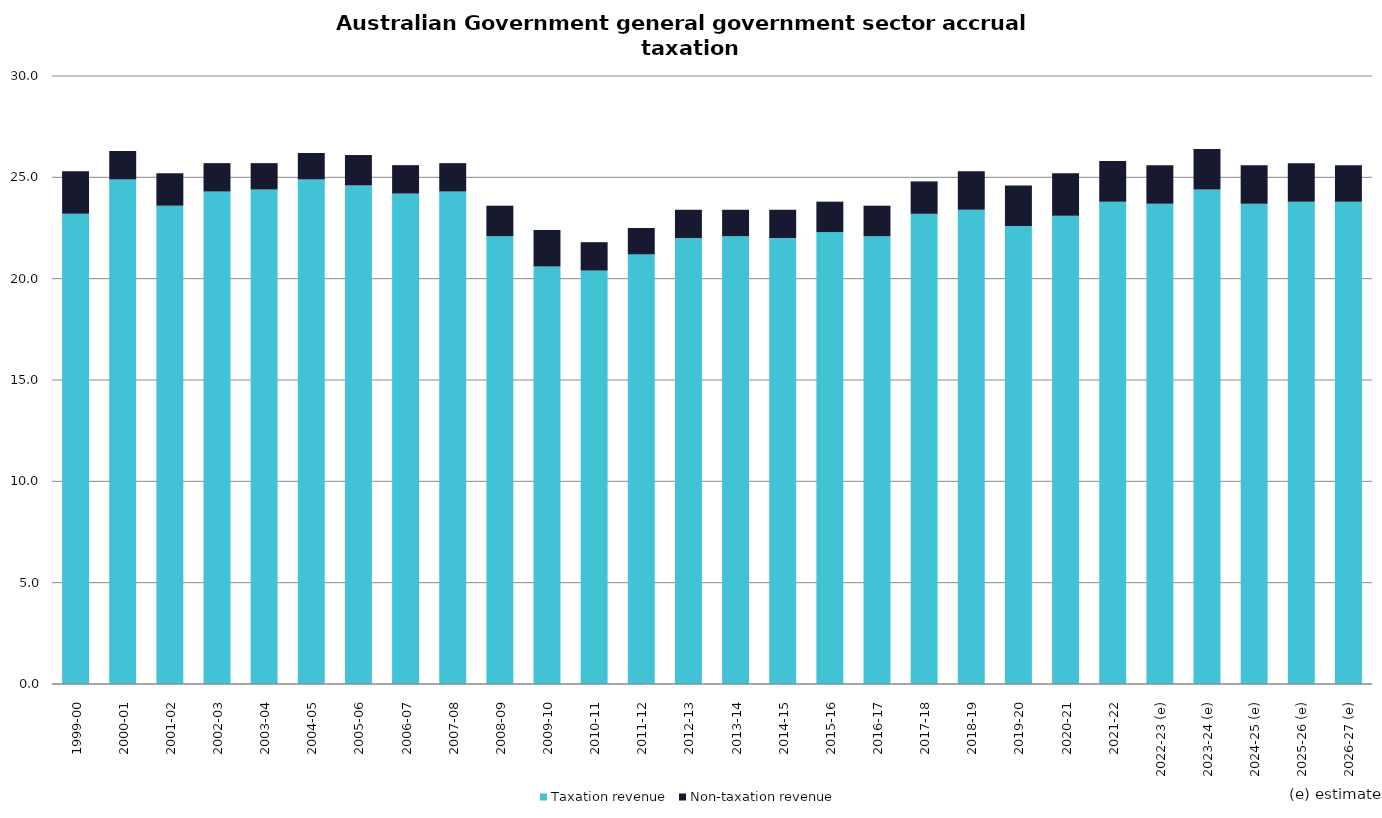
| Category | Taxation revenue | Non-taxation revenue |
|---|---|---|
| 1999-00 | 23.2 | 2.1 |
| 2000-01 | 24.9 | 1.4 |
| 2001-02 | 23.6 | 1.6 |
| 2002-03 | 24.3 | 1.4 |
| 2003-04 | 24.4 | 1.3 |
| 2004-05 | 24.9 | 1.3 |
| 2005-06 | 24.6 | 1.5 |
| 2006-07 | 24.2 | 1.4 |
| 2007-08 | 24.3 | 1.4 |
| 2008-09 | 22.1 | 1.5 |
| 2009-10 | 20.6 | 1.8 |
| 2010-11 | 20.4 | 1.4 |
| 2011-12 | 21.2 | 1.3 |
| 2012-13 | 22 | 1.4 |
| 2013-14 | 22.1 | 1.3 |
| 2014-15 | 22 | 1.4 |
| 2015-16 | 22.3 | 1.5 |
| 2016-17 | 22.1 | 1.5 |
| 2017-18 | 23.2 | 1.6 |
| 2018-19 | 23.4 | 1.9 |
| 2019-20 | 22.6 | 2 |
| 2020-21 | 23.1 | 2.1 |
| 2021-22 | 23.8 | 2 |
| 2022-23 (e) | 23.7 | 1.9 |
| 2023-24 (e) | 24.4 | 2 |
| 2024-25 (e) | 23.7 | 1.9 |
| 2025-26 (e) | 23.8 | 1.9 |
| 2026-27 (e) | 23.8 | 1.8 |